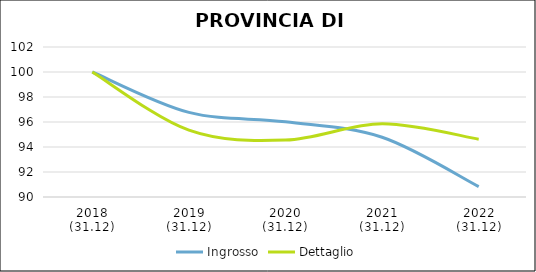
| Category | Ingrosso | Dettaglio |
|---|---|---|
| 2018
(31.12) | 100 | 100 |
| 2019
(31.12) | 96.77 | 95.345 |
| 2020
(31.12) | 96.014 | 94.553 |
| 2021
(31.12) | 94.777 | 95.859 |
| 2022
(31.12) | 90.835 | 94.625 |